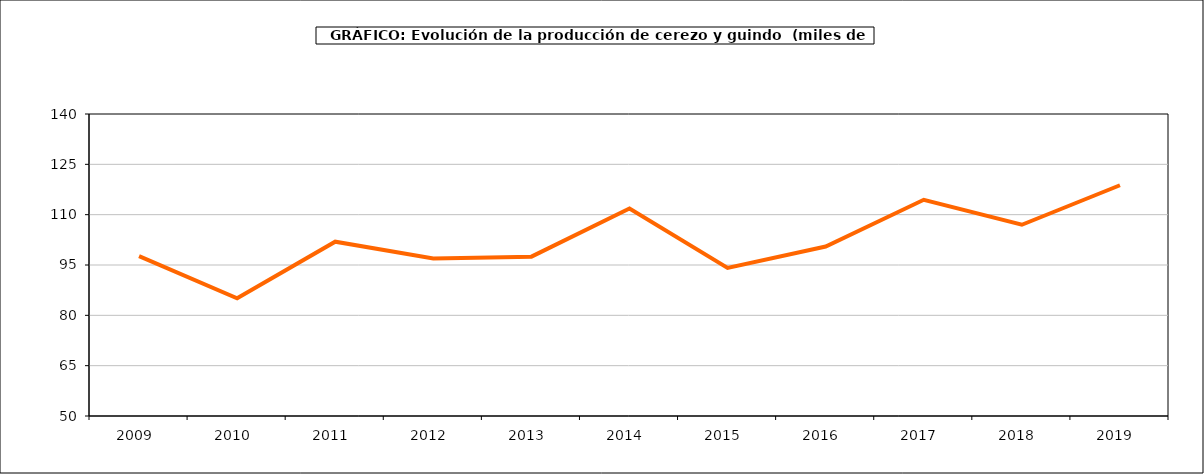
| Category | producción cerezo y guindo |
|---|---|
| 2009.0 | 97.645 |
| 2010.0 | 85.078 |
| 2011.0 | 101.945 |
| 2012.0 | 96.946 |
| 2013.0 | 97.489 |
| 2014.0 | 111.821 |
| 2015.0 | 94.143 |
| 2016.0 | 100.503 |
| 2017.0 | 114.433 |
| 2018.0 | 107 |
| 2019.0 | 118.762 |